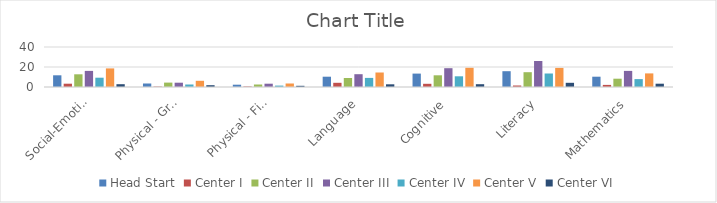
| Category | Head Start | Center I | Center II | Center III | Center IV | Center V | Center VI |
|---|---|---|---|---|---|---|---|
| Social-Emotional | 11.7 | 3.3 | 12.7 | 16.1 | 9.3 | 18.6 | 2.8 |
| Physical - Gross Motor | 3.5 | 0.4 | 4.4 | 4.3 | 2.5 | 6.2 | 1.8 |
| Physical - Fine Motor | 2.3 | 0.5 | 2.5 | 3.3 | 1.4 | 3.5 | 1.2 |
| Language | 10.3 | 4.2 | 9 | 12.8 | 9.1 | 14.5 | 2.7 |
| Cognitive | 13.4 | 3.2 | 11.7 | 18.8 | 10.7 | 19.2 | 2.8 |
| Literacy | 15.8 | 1.5 | 14.8 | 26 | 13.5 | 19.1 | 4.2 |
| Mathematics | 10.3 | 2.1 | 8.3 | 16.1 | 7.9 | 13.6 | 3.3 |